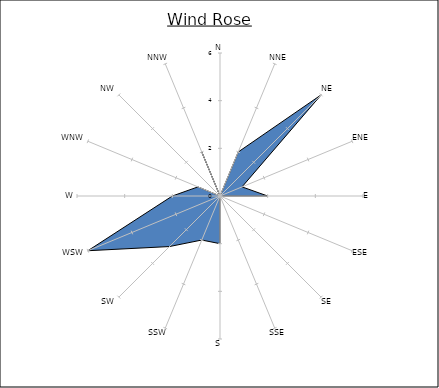
| Category | Series 0 |
|---|---|
| N | 0 |
| NNE | 2 |
| NE | 6 |
| ENE | 1 |
| E | 2 |
| ESE | 0 |
| SE | 0 |
| SSE | 0 |
| S | 2 |
| SSW | 2 |
| SW | 3 |
| WSW | 6 |
| W | 2 |
| WNW | 1 |
| NW | 0 |
| NNW | 2 |